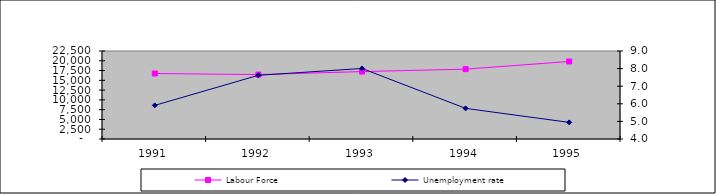
| Category | Labour Force |
|---|---|
| 1991.0 | 16745 |
| 1992.0 | 16470 |
| 1993.0 | 17235 |
| 1994.0 | 17855 |
| 1995.0 | 19820 |